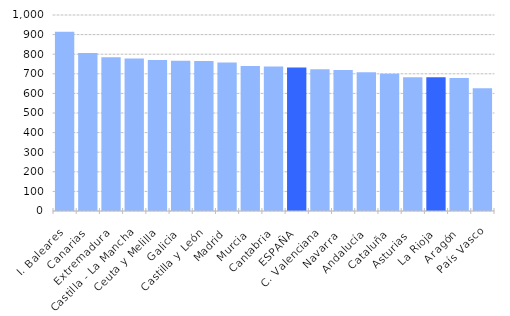
| Category | Series 1 |
|---|---|
| I. Baleares | 915.174 |
| Canarias | 806.716 |
| Extremadura | 784.416 |
| Castilla - La Mancha | 778.41 |
| Ceuta y Melilla | 770.372 |
| Galicia | 766.732 |
| Castilla y León | 765.299 |
| Madrid | 757.556 |
| Murcia | 740.345 |
| Cantabria | 736.774 |
| ESPAÑA | 732.247 |
| C. Valenciana | 722.888 |
| Navarra  | 719.839 |
| Andalucía | 707.311 |
| Cataluña | 700.067 |
| Asturias  | 682.589 |
| La Rioja | 681.886 |
| Aragón | 678.189 |
| País Vasco | 626.863 |